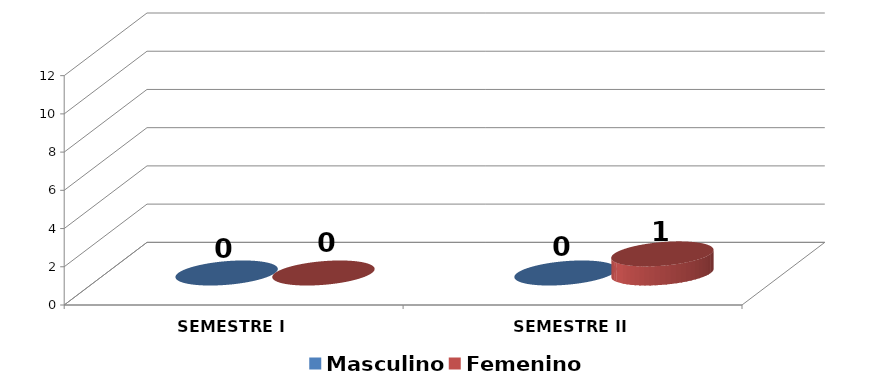
| Category | Masculino | Femenino |
|---|---|---|
| SEMESTRE I | 0 | 0 |
| SEMESTRE II | 0 | 1 |